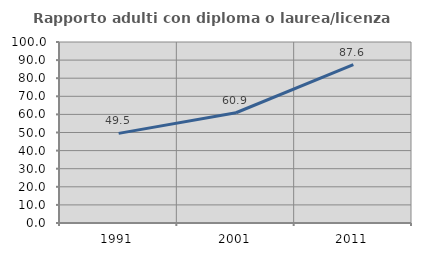
| Category | Rapporto adulti con diploma o laurea/licenza media  |
|---|---|
| 1991.0 | 49.507 |
| 2001.0 | 60.907 |
| 2011.0 | 87.553 |